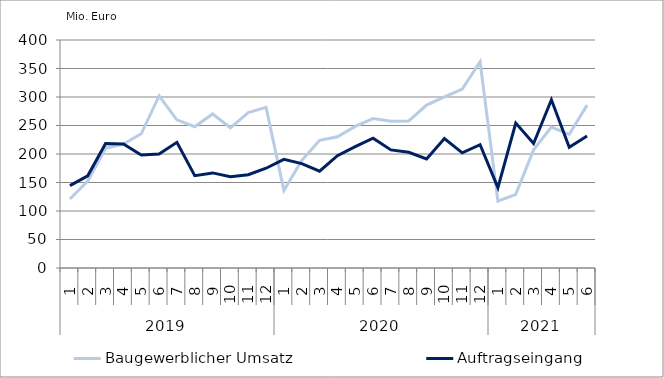
| Category | Baugewerblicher Umsatz | Auftragseingang |
|---|---|---|
| 0 | 120975.133 | 144510.881 |
| 1 | 152329.786 | 161685.201 |
| 2 | 210227.67 | 218455.879 |
| 3 | 217522.321 | 217610.064 |
| 4 | 235490.429 | 198110.439 |
| 5 | 301963.302 | 200012.086 |
| 6 | 259975.317 | 220559.061 |
| 7 | 247779.658 | 162059.723 |
| 8 | 270249.609 | 166829.611 |
| 9 | 245966.91 | 160120.773 |
| 10 | 272620.351 | 163589.389 |
| 11 | 281810.121 | 175051.247 |
| 12 | 136135.432 | 190647.086 |
| 13 | 188682.361 | 183141.14 |
| 14 | 224009.315 | 169770.009 |
| 15 | 230172.252 | 196979.845 |
| 16 | 248410.714 | 212955.83 |
| 17 | 262078.128 | 227853.487 |
| 18 | 257360.37 | 207209.188 |
| 19 | 257932.168 | 202976.091 |
| 20 | 285866.269 | 191463.844 |
| 21 | 300164.57 | 227245.467 |
| 22 | 313922.518 | 202060.636 |
| 23 | 362040.738 | 216296.504 |
| 24 | 117421.805 | 141020.655 |
| 25 | 129162.55 | 254416.876 |
| 26 | 207280.837 | 218451.405 |
| 27 | 247094.279 | 295077.868 |
| 28 | 234515.312 | 211696.129 |
| 29 | 285732.845 | 231455.155 |